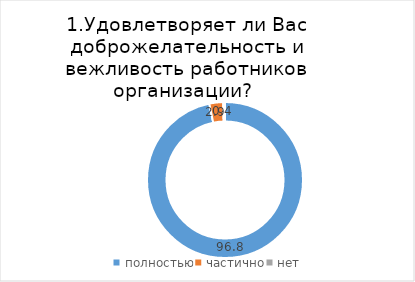
| Category | Александровский |
|---|---|
| полностью | 96.774 |
| частично | 2.867 |
| нет | 0.358 |